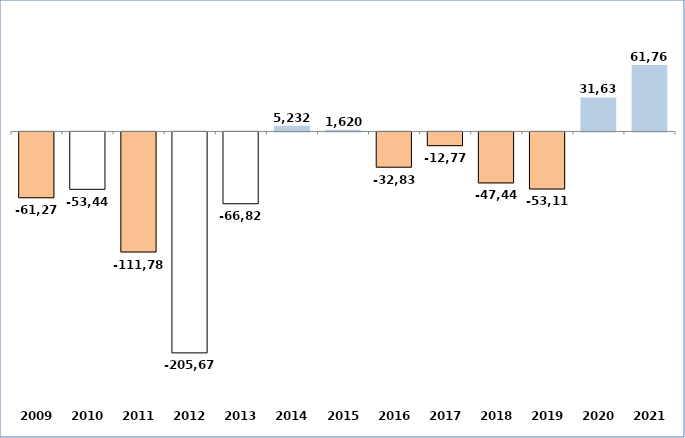
| Category | Series 0 |
|---|---|
| 2009 | -61276.29 |
| 2010 | -53439.67 |
| 2011 | -111782.25 |
| 2012 | -205678.49 |
| 2013 | -66829.32 |
| 2014 | 5231.97 |
| 2015 | 1619.95 |
| 2016 | -32832.02 |
| 2017 | -12772.83 |
| 2018 | -47448.62 |
| 2019 | -53114 |
| 2020 | 31638 |
| 2021 | 61768.16 |